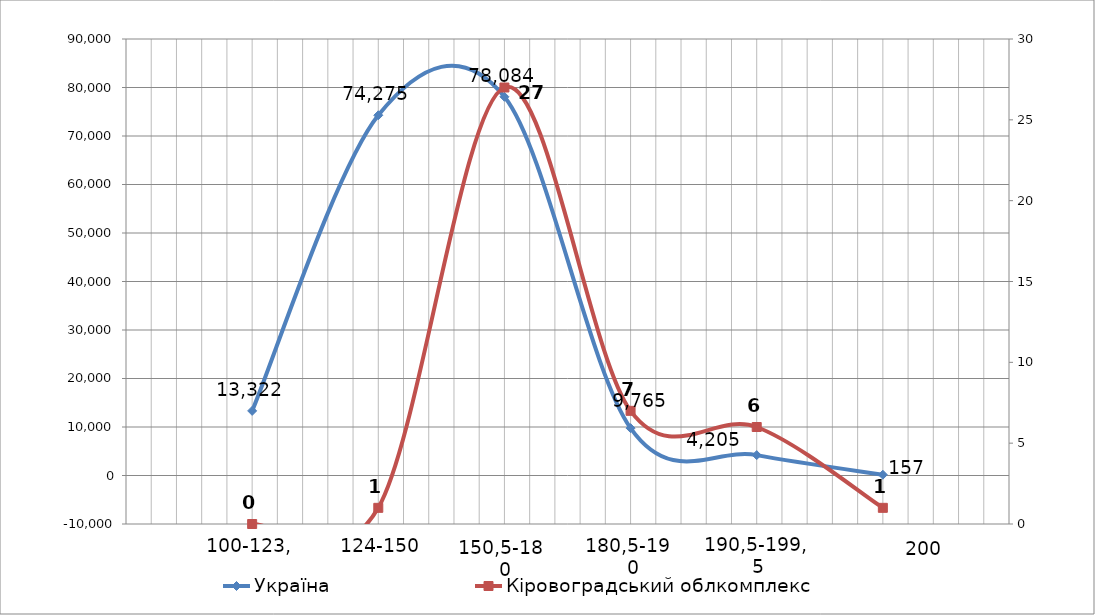
| Category | Україна |
|---|---|
| 0 | 13322 |
| 1 | 74275 |
| 2 | 78084 |
| 3 | 9765 |
| 4 | 4205 |
| 5 | 157 |